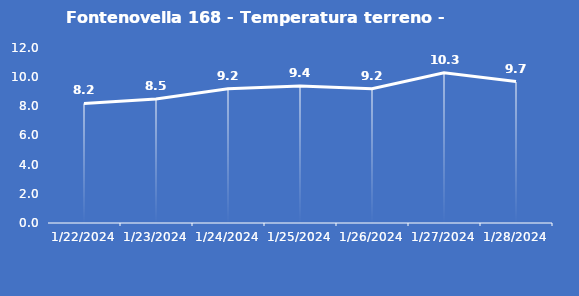
| Category | Fontenovella 168 - Temperatura terreno - Grezzo (°C) |
|---|---|
| 1/22/24 | 8.2 |
| 1/23/24 | 8.5 |
| 1/24/24 | 9.2 |
| 1/25/24 | 9.4 |
| 1/26/24 | 9.2 |
| 1/27/24 | 10.3 |
| 1/28/24 | 9.7 |